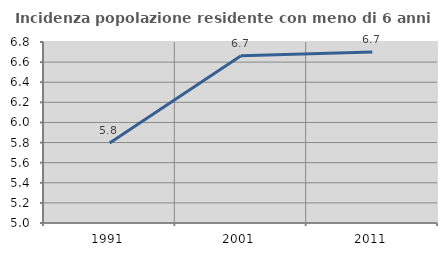
| Category | Incidenza popolazione residente con meno di 6 anni |
|---|---|
| 1991.0 | 5.796 |
| 2001.0 | 6.664 |
| 2011.0 | 6.701 |